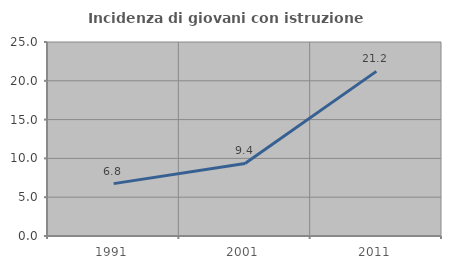
| Category | Incidenza di giovani con istruzione universitaria |
|---|---|
| 1991.0 | 6.751 |
| 2001.0 | 9.355 |
| 2011.0 | 21.212 |